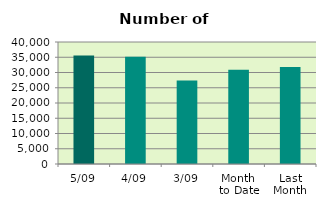
| Category | Series 0 |
|---|---|
| 5/09 | 35558 |
| 4/09 | 35166 |
| 3/09 | 27418 |
| Month 
to Date | 30933 |
| Last
Month | 31813.182 |